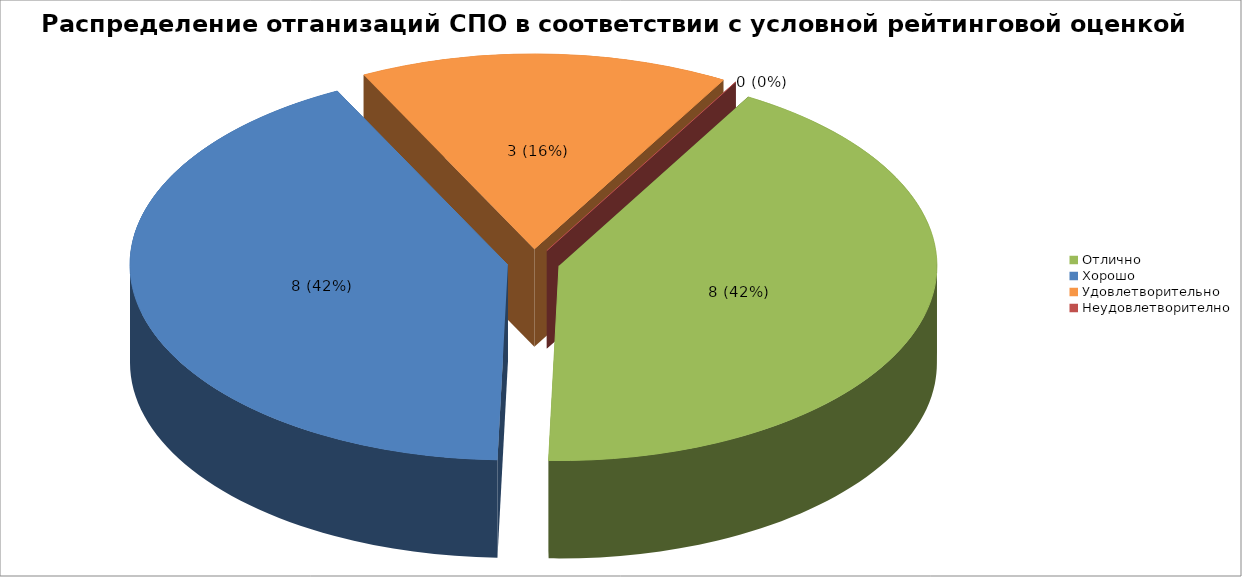
| Category | Series 8 | Series 9 |
|---|---|---|
| Отлично | 0.421 |  |
| Хорошо | 0.421 |  |
| Удовлетворительно | 0.158 |  |
| Неудовлетворително | 0 |  |